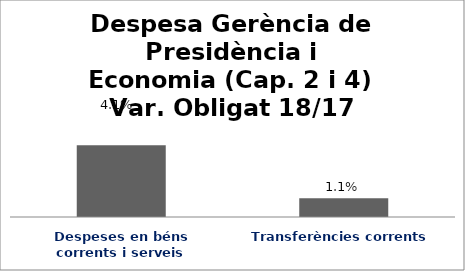
| Category | Series 0 |
|---|---|
| Despeses en béns corrents i serveis | 0.041 |
| Transferències corrents | 0.011 |